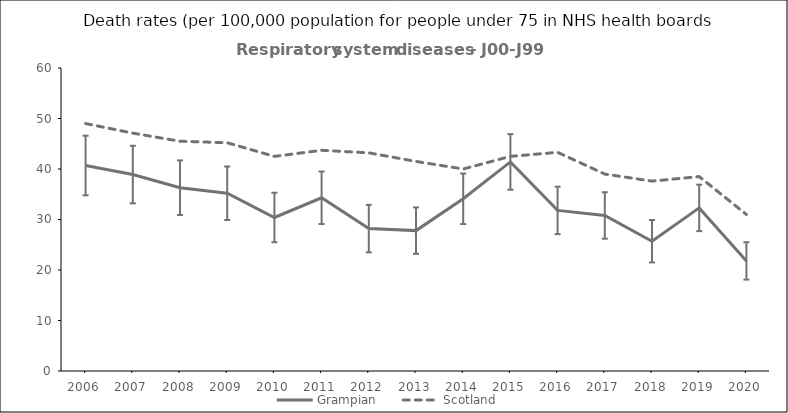
| Category | Grampian | Scotland |
|---|---|---|
| 2006.0 | 40.7 | 49 |
| 2007.0 | 38.9 | 47.1 |
| 2008.0 | 36.3 | 45.5 |
| 2009.0 | 35.2 | 45.2 |
| 2010.0 | 30.4 | 42.5 |
| 2011.0 | 34.3 | 43.7 |
| 2012.0 | 28.2 | 43.2 |
| 2013.0 | 27.8 | 41.5 |
| 2014.0 | 34.1 | 40 |
| 2015.0 | 41.4 | 42.5 |
| 2016.0 | 31.8 | 43.3 |
| 2017.0 | 30.8 | 39 |
| 2018.0 | 25.7 | 37.6 |
| 2019.0 | 32.3 | 38.5 |
| 2020.0 | 21.8 | 31 |